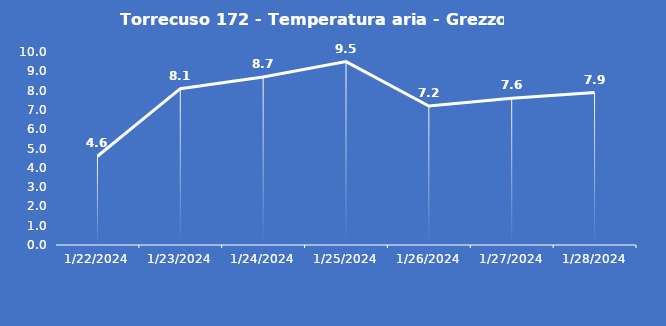
| Category | Torrecuso 172 - Temperatura aria - Grezzo (°C) |
|---|---|
| 1/22/24 | 4.6 |
| 1/23/24 | 8.1 |
| 1/24/24 | 8.7 |
| 1/25/24 | 9.5 |
| 1/26/24 | 7.2 |
| 1/27/24 | 7.6 |
| 1/28/24 | 7.9 |